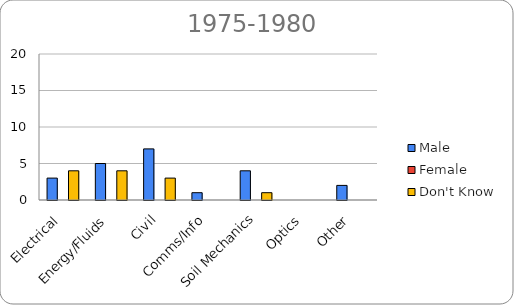
| Category | Male | Female | Don't Know |
|---|---|---|---|
| Electrical | 3 | 0 | 4 |
| Energy/Fluids | 5 | 0 | 4 |
| Civil | 7 | 0 | 3 |
| Comms/Info | 1 | 0 | 0 |
| Soil Mechanics | 4 | 0 | 1 |
| Optics | 0 | 0 | 0 |
| Other | 2 | 0 | 0 |